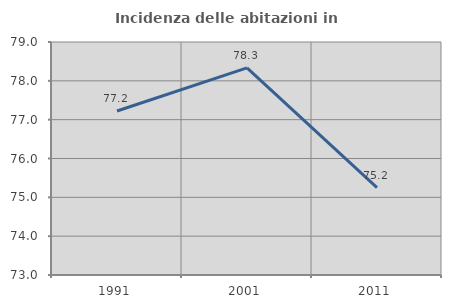
| Category | Incidenza delle abitazioni in proprietà  |
|---|---|
| 1991.0 | 77.222 |
| 2001.0 | 78.333 |
| 2011.0 | 75.248 |